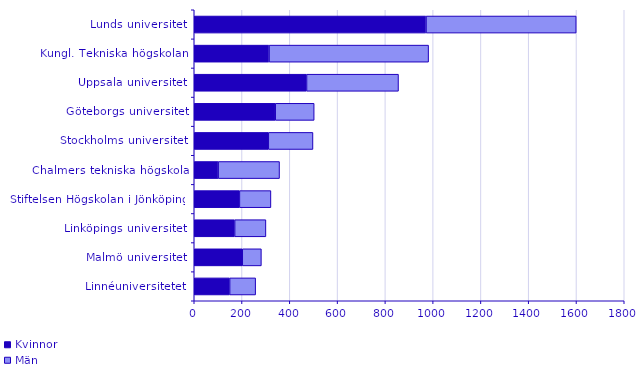
| Category | Kvinnor | Män |
|---|---|---|
| Linnéuniversitetet | 148 | 109 |
| Malmö universitet | 201 | 80 |
| Linköpings universitet | 169 | 131 |
| Stiftelsen Högskolan i Jönköping | 189 | 132 |
| Chalmers tekniska högskola | 100 | 257 |
| Stockholms universitet | 310 | 187 |
| Göteborgs universitet | 339 | 163 |
| Uppsala universitet | 470 | 385 |
| Kungl. Tekniska högskolan | 313 | 668 |
| Lunds universitet | 970 | 629 |